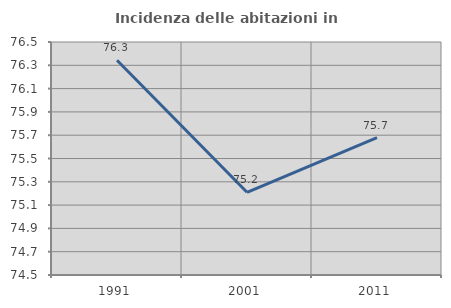
| Category | Incidenza delle abitazioni in proprietà  |
|---|---|
| 1991.0 | 76.343 |
| 2001.0 | 75.21 |
| 2011.0 | 75.678 |